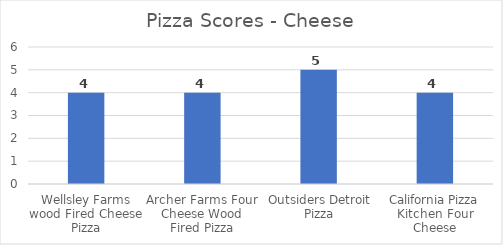
| Category | Series 0 |
|---|---|
| Wellsley Farms wood Fired Cheese Pizza | 4 |
| Archer Farms Four Cheese Wood Fired Pizza | 4 |
| Outsiders Detroit Pizza | 5 |
| California Pizza Kitchen Four Cheese | 4 |